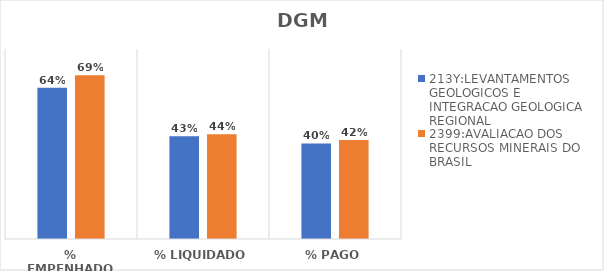
| Category | 213Y:LEVANTAMENTOS GEOLOGICOS E INTEGRACAO GEOLOGICA REGIONAL | 2399:AVALIACAO DOS RECURSOS MINERAIS DO BRASIL |
|---|---|---|
| % EMPENHADO | 0.636 | 0.69 |
| % LIQUIDADO | 0.433 | 0.441 |
| % PAGO | 0.403 | 0.417 |